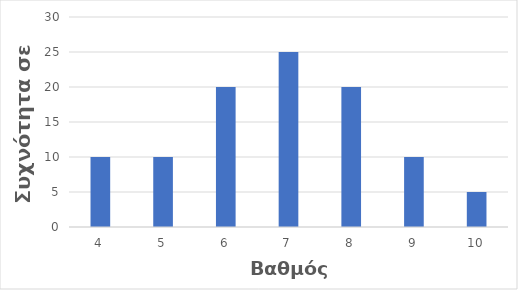
| Category | % |
|---|---|
| 4.0 | 10 |
| 5.0 | 10 |
| 6.0 | 20 |
| 7.0 | 25 |
| 8.0 | 20 |
| 9.0 | 10 |
| 10.0 | 5 |